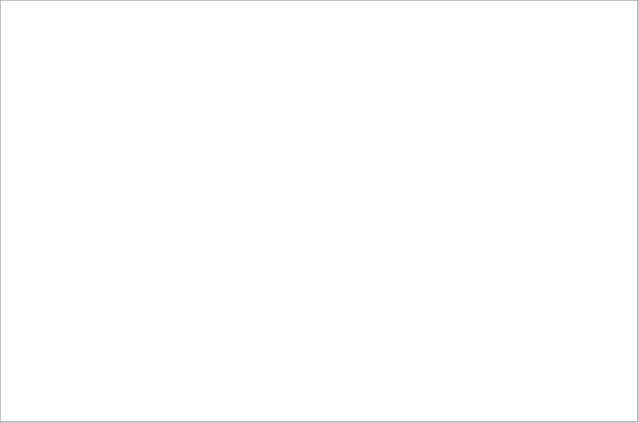
| Category | 2004 | 2005 | 2006 | 2008 | 2009 | 2010 | 2011 | 2012 | 2013 |
|---|---|---|---|---|---|---|---|---|---|
| Afganistan | 1 | 2 | 0 | 1 | 0 | 1 | 4 | 4 | 8 |